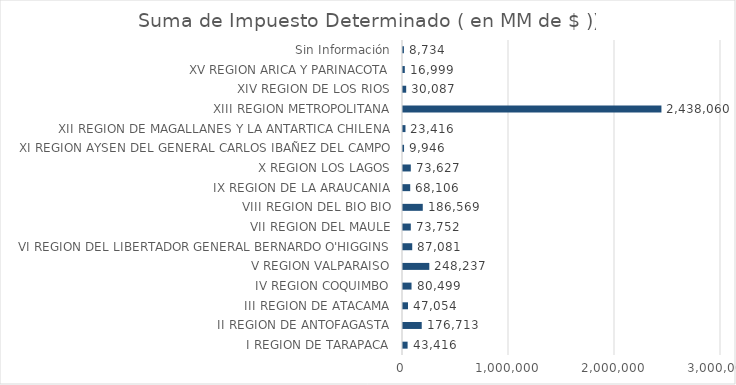
| Category | Series 0 |
|---|---|
|    I REGION DE TARAPACA | 43416.2 |
|   II REGION DE ANTOFAGASTA | 176712.5 |
|  III REGION DE ATACAMA | 47054 |
|   IV REGION COQUIMBO | 80498.9 |
|    V REGION VALPARAISO | 248236.9 |
|   VI REGION DEL LIBERTADOR GENERAL BERNARDO O'HIGGINS | 87080.7 |
|  VII REGION DEL MAULE | 73751.7 |
| VIII REGION DEL BIO BIO | 186568.6 |
|   IX REGION DE LA ARAUCANIA | 68106.2 |
|    X REGION LOS LAGOS | 73627 |
|   XI REGION AYSEN DEL GENERAL CARLOS IBAÑEZ DEL CAMPO | 9946.4 |
|  XII REGION DE MAGALLANES Y LA ANTARTICA CHILENA | 23416.2 |
| XIII REGION METROPOLITANA | 2438059.9 |
|  XIV REGION DE LOS RIOS | 30086.9 |
|   XV REGION ARICA Y PARINACOTA | 16998.6 |
| Sin Información | 8734 |